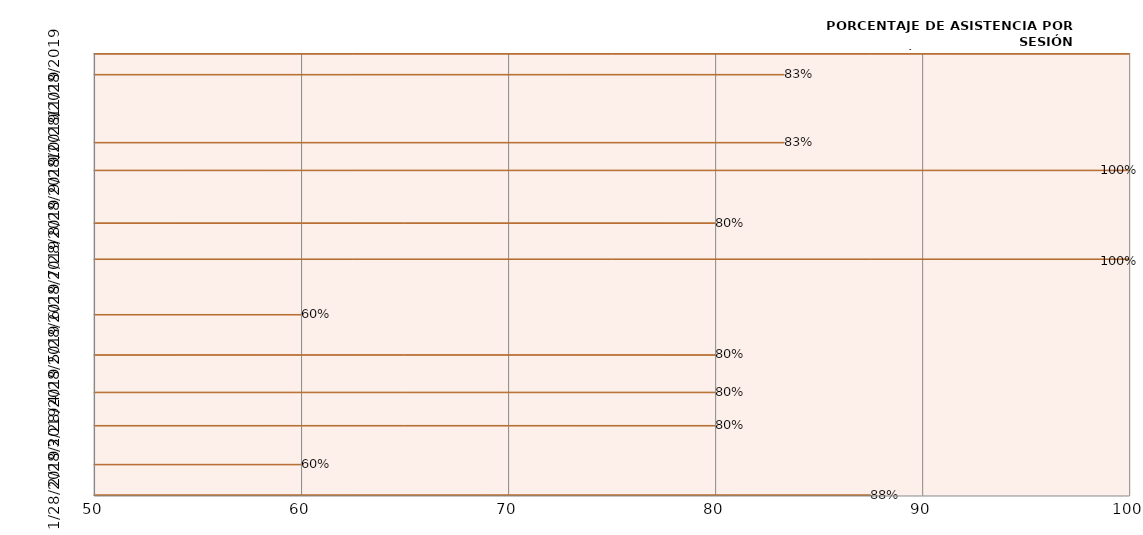
| Category | Series 0 |
|---|---|
| 1/28/19 | 87.5 |
| 2/19/19 | 60 |
| 3/19/19 | 80 |
| 4/12/19 | 80 |
| 5/9/19 | 80 |
| 6/7/19 | 60 |
| 7/17/19 | 100 |
| 8/12/19 | 80 |
| 9/19/19 | 100 |
| 10/9/19 | 83.333 |
| 11/27/19 | 83.333 |
| 12/12/19 | 100 |